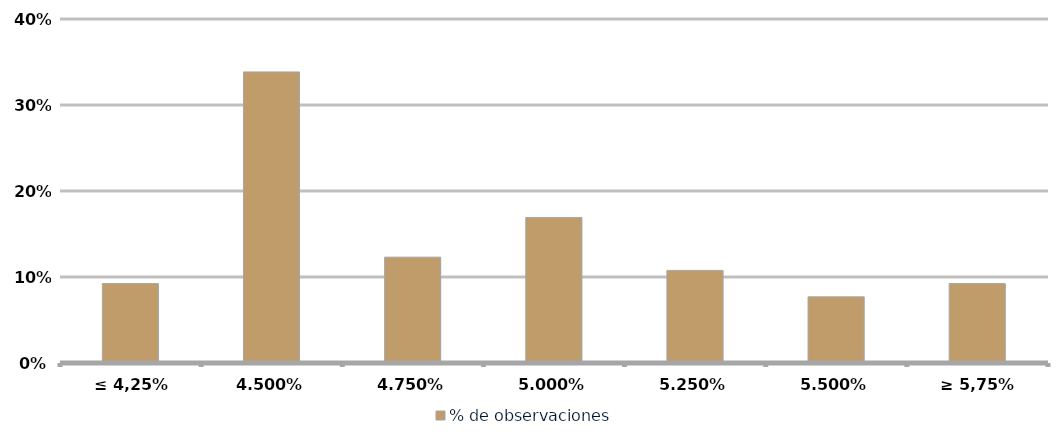
| Category | % de observaciones  |
|---|---|
| ≤ 4,25% | 0.092 |
| 4,50% | 0.338 |
| 4,75% | 0.123 |
| 5,00% | 0.169 |
| 5,25% | 0.108 |
| 5,50% | 0.077 |
| ≥ 5,75% | 0.092 |